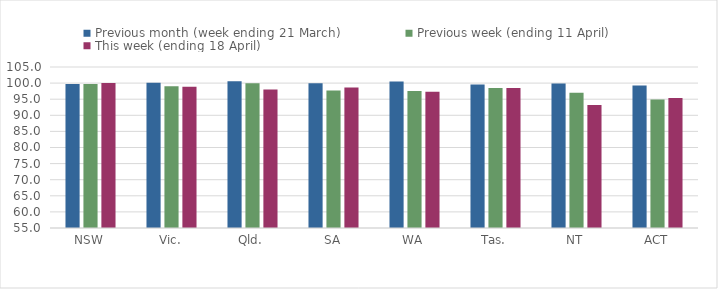
| Category | Previous month (week ending 21 March) | Previous week (ending 11 April) | This week (ending 18 April) |
|---|---|---|---|
| NSW | 99.695 | 99.698 | 100.045 |
| Vic. | 100.134 | 99.011 | 98.889 |
| Qld. | 100.604 | 99.957 | 98.019 |
| SA | 99.96 | 97.698 | 98.664 |
| WA | 100.507 | 97.573 | 97.278 |
| Tas. | 99.585 | 98.5 | 98.48 |
| NT | 99.888 | 96.98 | 93.194 |
| ACT | 99.269 | 94.88 | 95.354 |